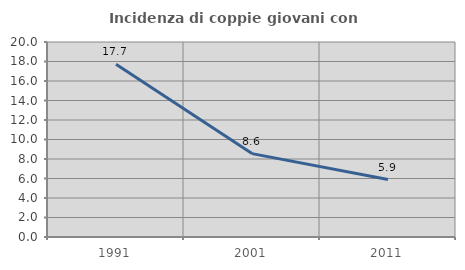
| Category | Incidenza di coppie giovani con figli |
|---|---|
| 1991.0 | 17.726 |
| 2001.0 | 8.553 |
| 2011.0 | 5.894 |